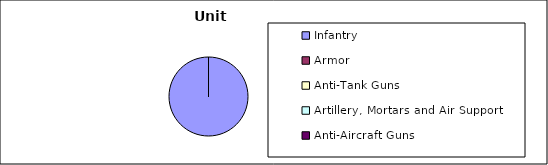
| Category | Series 0 |
|---|---|
| Infantry | 135 |
| Armor | 0 |
| Anti-Tank Guns | 0 |
| Artillery, Mortars and Air Support | 0 |
| Anti-Aircraft Guns | 0 |